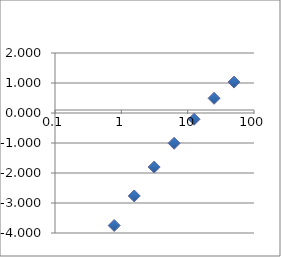
| Category | Series 0 |
|---|---|
| 50.0 | 1.031 |
| 25.0 | 0.49 |
| 12.5 | -0.207 |
| 6.25 | -1.009 |
| 3.125 | -1.802 |
| 1.5625 | -2.765 |
| 0.78125 | -3.751 |